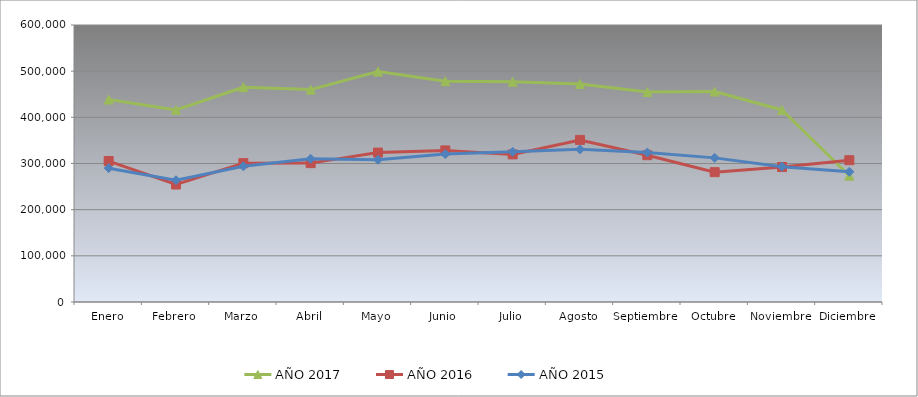
| Category | AÑO 2017 | AÑO 2016 | AÑO 2015 |
|---|---|---|---|
| Enero | 438620 | 305320.907 | 289914.473 |
| Febrero | 416080 | 254451.373 | 263753.673 |
| Marzo | 465220 | 300751.083 | 293941.062 |
| Abril | 460080 | 300827.132 | 310222.79 |
| Mayo | 499060 | 323696.99 | 308104.618 |
| Junio | 478220 | 328322.122 | 320373.51 |
| Julio | 476900 | 319721.728 | 325325.081 |
| Agosto | 472220 | 351039.883 | 330654.897 |
| Septiembre | 454800 | 317951.872 | 323722.698 |
| Octubre | 455720 | 281185.878 | 312196.541 |
| Noviembre | 416040 | 292389.205 | 293088.292 |
| Diciembre | 273500 | 307090.763 | 282046.977 |